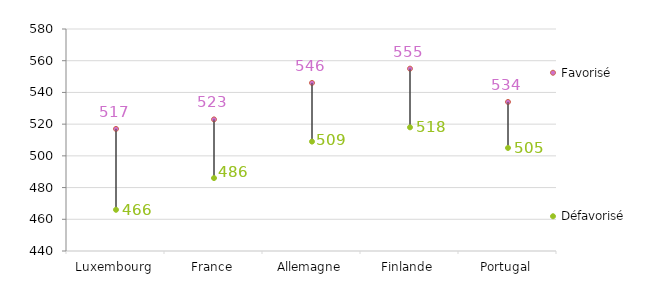
| Category | Favorisé | Défavorisé |
|---|---|---|
| Luxembourg | 517 | 466 |
| France | 523 | 486 |
| Allemagne | 546 | 509 |
| Finlande | 555 | 518 |
| Portugal | 534 | 505 |